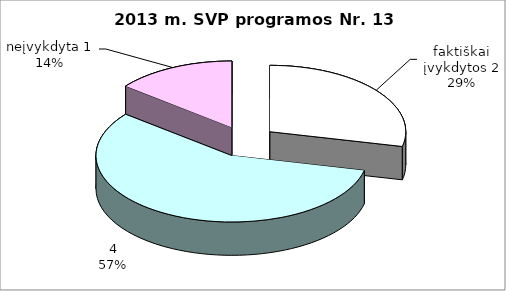
| Category | Series 0 |
|---|---|
| 0 | 2 |
| 1 | 4 |
| 2 | 1 |